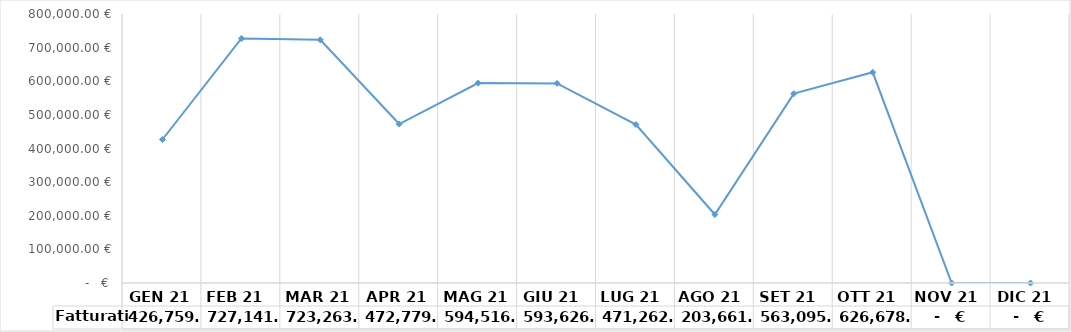
| Category | Fatturati |
|---|---|
|  GEN 21   | 426759.31 |
|  FEB 21   | 727141.7 |
|  MAR 21   | 723263.82 |
|  APR 21   | 472779.622 |
|  MAG 21   | 594516.93 |
| GIU 21  | 593626.928 |
| LUG 21  | 471262.028 |
| AGO 21  | 203661.981 |
| SET 21  | 563095.222 |
| OTT 21  | 626678.869 |
| NOV 21  | 0 |
| DIC 21  | 0 |